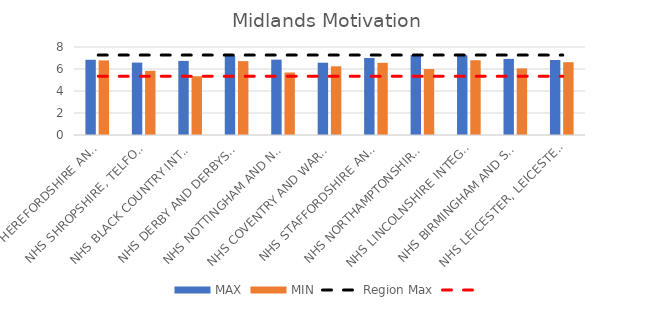
| Category | MAX | MIN |
|---|---|---|
| NHS HEREFORDSHIRE AND WORCESTERSHIRE INTEGRATED CARE BOARD | 6.839 | 6.78 |
| NHS SHROPSHIRE, TELFORD AND WREKIN INTEGRATED CARE BOARD | 6.583 | 5.833 |
| NHS BLACK COUNTRY INTEGRATED CARE BOARD | 6.738 | 5.339 |
| NHS DERBY AND DERBYSHIRE INTEGRATED CARE BOARD | 7.194 | 6.715 |
| NHS NOTTINGHAM AND NOTTINGHAMSHIRE INTEGRATED CARE BOARD | 6.852 | 5.682 |
| NHS COVENTRY AND WARWICKSHIRE INTEGRATED CARE BOARD | 6.573 | 6.247 |
| NHS STAFFORDSHIRE AND STOKE-ON-TRENT INTEGRATED CARE BOARD | 7.004 | 6.562 |
| NHS NORTHAMPTONSHIRE INTEGRATED CARE BOARD | 7.265 | 5.997 |
| NHS LINCOLNSHIRE INTEGRATED CARE BOARD | 7.244 | 6.796 |
| NHS BIRMINGHAM AND SOLIHULL INTEGRATED CARE BOARD | 6.919 | 6.053 |
| NHS LEICESTER, LEICESTERSHIRE AND RUTLAND INTEGRATED CARE BOARD | 6.816 | 6.618 |